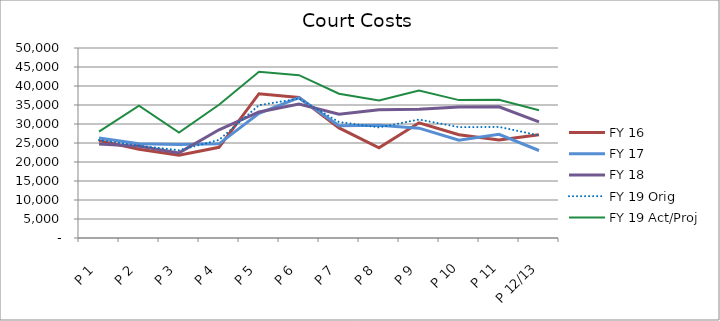
| Category | FY 16 | FY 17 | FY 18 | FY 19 Orig | FY 19 Act/Proj |
|---|---|---|---|---|---|
| P 1 | 25621.78 | 26315.59 | 24706.23 | 25764.791 | 28002.78 |
| P 2 | 23374.17 | 24785.66 | 24165.82 | 24285.018 | 34823.53 |
| P 3 | 21758.94 | 24596.42 | 22388.57 | 23099.904 | 27732.84 |
| P 4 | 23874.1 | 24779.6 | 28469.83 | 25809.017 | 35079.13 |
| P 5 | 37971.74 | 32788.7 | 33157.63 | 34949.738 | 43742.85 |
| P 6 | 36965.45 | 36933.63 | 35232.26 | 36685.123 | 42839.46 |
| P 7 | 28972.74 | 29558.52 | 32566.08 | 30520.112 | 37967.406 |
| P 8 | 23732.57 | 29646.3 | 33776.17 | 29109.892 | 36213.075 |
| P 9 | 30311 | 28907.69 | 33879.57 | 31172.802 | 38779.361 |
| P 10 | 27159.59 | 25728.2 | 34480.57 | 29167.278 | 36284.464 |
| P 11 | 25767 | 27269.15 | 34525.22 | 29230.228 | 36362.774 |
| P 12/13 | 27182 | 23024.26 | 30553.17 | 27006.097 | 33595.927 |